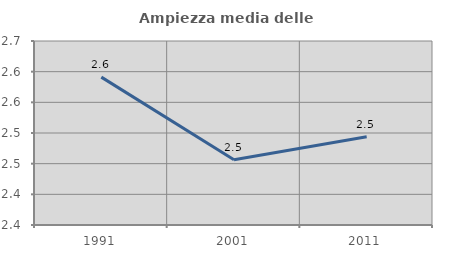
| Category | Ampiezza media delle famiglie |
|---|---|
| 1991.0 | 2.591 |
| 2001.0 | 2.456 |
| 2011.0 | 2.494 |